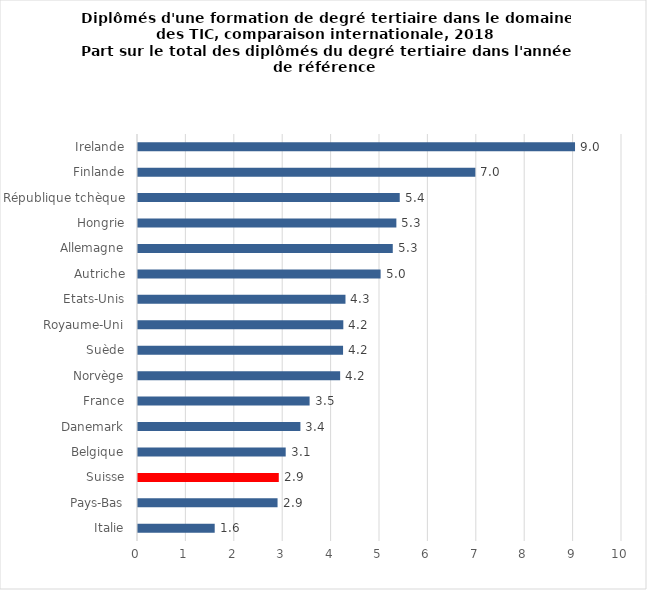
| Category | 2018 |
|---|---|
| Italie | 1.585 |
| Pays-Bas | 2.883 |
| Suisse | 2.909 |
| Belgique | 3.052 |
| Danemark | 3.356 |
| France | 3.546 |
| Norvège | 4.177 |
| Suède | 4.237 |
| Royaume-Uni | 4.242 |
| Etats-Unis | 4.287 |
| Autriche | 5.013 |
| Allemagne | 5.264 |
| Hongrie | 5.338 |
| République tchèque | 5.408 |
| Finlande | 6.97 |
| Irelande | 9.03 |